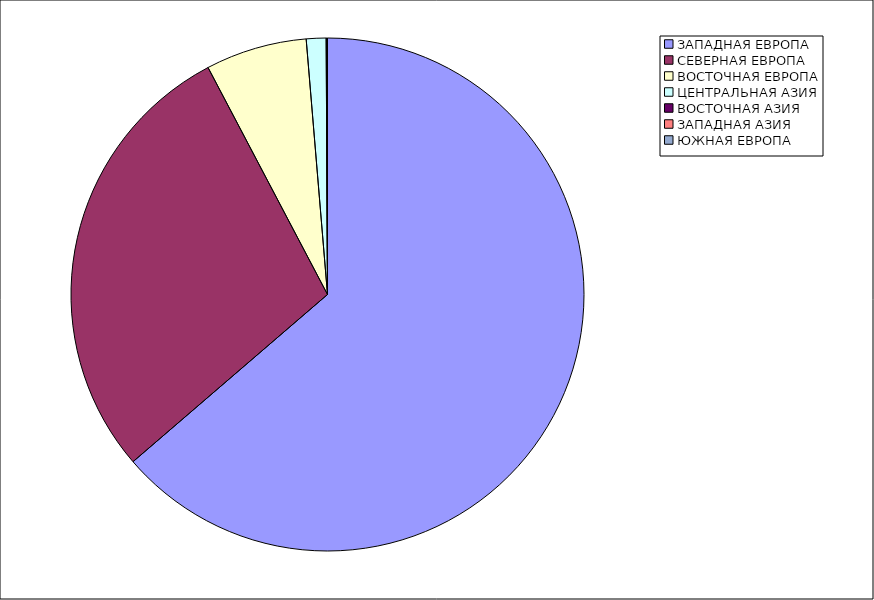
| Category | Оборот |
|---|---|
| ЗАПАДНАЯ ЕВРОПА | 63.697 |
| СЕВЕРНАЯ ЕВРОПА | 28.591 |
| ВОСТОЧНАЯ ЕВРОПА | 6.386 |
| ЦЕНТРАЛЬНАЯ АЗИЯ | 1.243 |
| ВОСТОЧНАЯ АЗИЯ | 0.045 |
| ЗАПАДНАЯ АЗИЯ | 0.033 |
| ЮЖНАЯ ЕВРОПА | 0.006 |